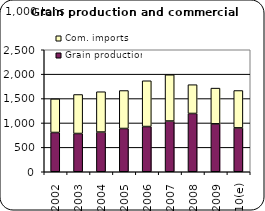
| Category | Grain production | Com. imports |
|---|---|---|
| 2002 | 804.534 | 688.287 |
| 2003 | 783.961 | 799.158 |
| 2004 | 813.364 | 826.576 |
| 2005 | 886.322 | 778.032 |
| 2006 | 926.758 | 937.847 |
| 2007 | 1039.426 | 947.674 |
| 2008 | 1194.31 | 589.869 |
| 2009 | 982.203 | 732.002 |
| 2010(e) | 898.763 | 766.078 |